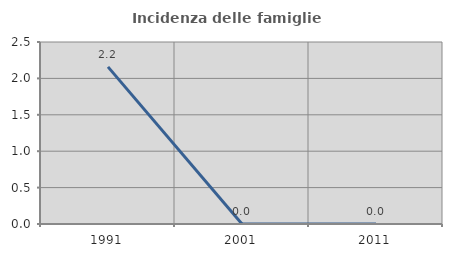
| Category | Incidenza delle famiglie numerose |
|---|---|
| 1991.0 | 2.158 |
| 2001.0 | 0 |
| 2011.0 | 0 |